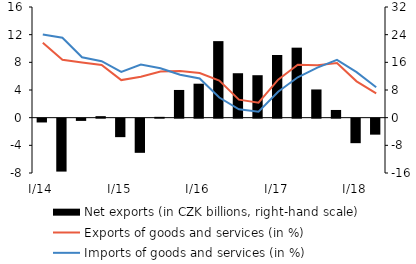
| Category | Net exports (in CZK billions, right-hand scale) |
|---|---|
| I/14 | -1.098 |
| II | -15.303 |
| III | -0.647 |
| IV | 0.436 |
| I/15 | -5.344 |
| II | -9.876 |
| III | 0.239 |
| IV | 8.012 |
| I/16 | 9.823 |
| II | 22.132 |
| III | 12.849 |
| IV | 12.276 |
| I/17 | 18.117 |
| II | 20.241 |
| III | 8.158 |
| IV | 2.227 |
| I/18 | -7.087 |
| II | -4.623 |